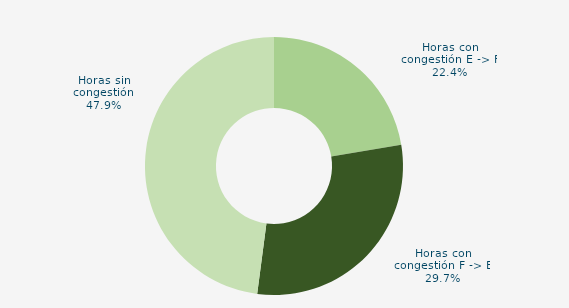
| Category | Horas con congestión E -> F |
|---|---|
| Horas con congestión E -> F | 22.361 |
| Horas con congestión F -> E | 29.722 |
| Horas sin congestión | 47.917 |